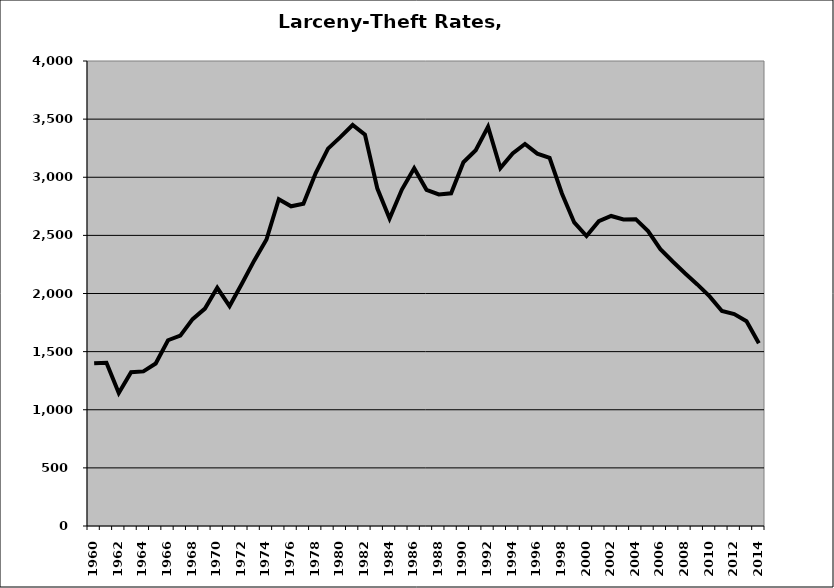
| Category | Larceny-Theft |
|---|---|
| 1960.0 | 1399.72 |
| 1961.0 | 1404.438 |
| 1962.0 | 1144.384 |
| 1963.0 | 1322.552 |
| 1964.0 | 1330.029 |
| 1965.0 | 1397.647 |
| 1966.0 | 1597.872 |
| 1967.0 | 1637.778 |
| 1968.0 | 1779.683 |
| 1969.0 | 1870 |
| 1970.0 | 2048.638 |
| 1971.0 | 1892.059 |
| 1972.0 | 2084.058 |
| 1973.0 | 2282.72 |
| 1974.0 | 2464.067 |
| 1975.0 | 2810.695 |
| 1976.0 | 2750.256 |
| 1977.0 | 2772.167 |
| 1978.0 | 3035.613 |
| 1979.0 | 3246 |
| 1980.0 | 3344.891 |
| 1981.0 | 3449.593 |
| 1982.0 | 3367.131 |
| 1983.0 | 2905.058 |
| 1984.0 | 2645.401 |
| 1985.0 | 2894.303 |
| 1986.0 | 3078.107 |
| 1987.0 | 2892.041 |
| 1988.0 | 2851.805 |
| 1989.0 | 2861.684 |
| 1990.0 | 3129.271 |
| 1991.0 | 3231.957 |
| 1992.0 | 3434.12 |
| 1993.0 | 3078.723 |
| 1994.0 | 3204.622 |
| 1995.0 | 3286.25 |
| 1996.0 | 3203.326 |
| 1997.0 | 3166.25 |
| 1998.0 | 2860.499 |
| 1999.0 | 2611.123 |
| 2000.0 | 2494.623 |
| 2001.0 | 2621.346 |
| 2002.0 | 2666.84 |
| 2003.0 | 2636.668 |
| 2004.0 | 2639.325 |
| 2005.0 | 2536.37 |
| 2006.0 | 2381.923 |
| 2007.0 | 2275.501 |
| 2008.0 | 2174.186 |
| 2009.0 | 2078.013 |
| 2010.0 | 1975.423 |
| 2011.0 | 1849.456 |
| 2012.0 | 1823.192 |
| 2013.0 | 1761.762 |
| 2014.0 | 1572.362 |